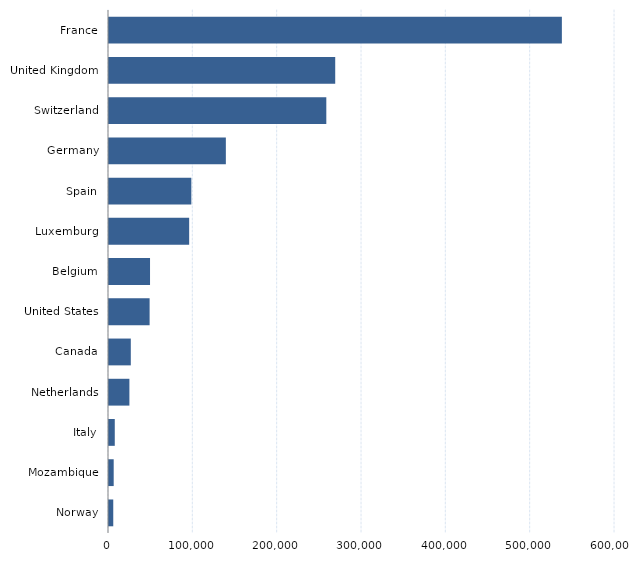
| Category | Series 0 |
|---|---|
| Norway | 5050 |
| Mozambique | 5560 |
| Italy | 6847 |
| Netherlands | 24193 |
| Canada | 25855 |
| United States | 48158 |
| Belgium | 48655 |
| Luxemburg | 95057 |
| Spain | 97628 |
| Germany | 138555 |
| Switzerland | 257691 |
| United Kingdom | 268245 |
| France | 537000 |